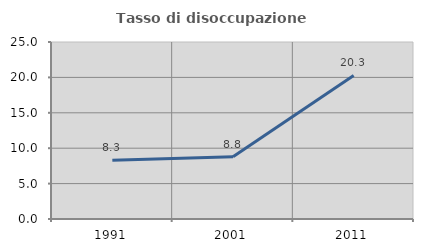
| Category | Tasso di disoccupazione giovanile  |
|---|---|
| 1991.0 | 8.293 |
| 2001.0 | 8.791 |
| 2011.0 | 20.27 |